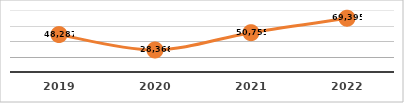
| Category | PERSONAS CAPACITADAS
PRIMER SEMESTRE, EJERCICIO 2022 |
|---|---|
| 2019.0 | 48287 |
| 2020.0 | 28368 |
| 2021.0 | 50755 |
| 2022.0 | 69395 |